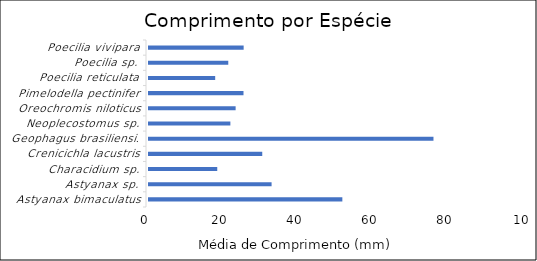
| Category | Series 0 |
|---|---|
| Astyanax bimaculatus | 52.36 |
| Astyanax sp. | 33.49 |
| Characidium sp. | 19 |
| Crenicichla lacustris | 31 |
| Geophagus brasiliensis | 76.66 |
| Neoplecostomus sp. | 22.5 |
| Oreochromis niloticus | 23.9 |
| Pimelodella pectinifer | 26 |
| Poecilia reticulata | 18.45 |
| Poecilia sp. | 21.94 |
| Poecilia vivipara | 26.04 |